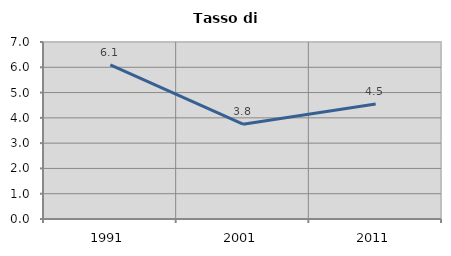
| Category | Tasso di disoccupazione   |
|---|---|
| 1991.0 | 6.098 |
| 2001.0 | 3.75 |
| 2011.0 | 4.545 |